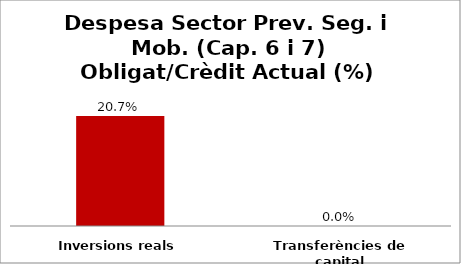
| Category | Series 0 |
|---|---|
| Inversions reals | 0.207 |
| Transferències de capital | 0 |